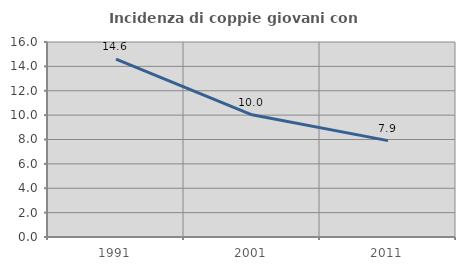
| Category | Incidenza di coppie giovani con figli |
|---|---|
| 1991.0 | 14.597 |
| 2001.0 | 10.025 |
| 2011.0 | 7.907 |